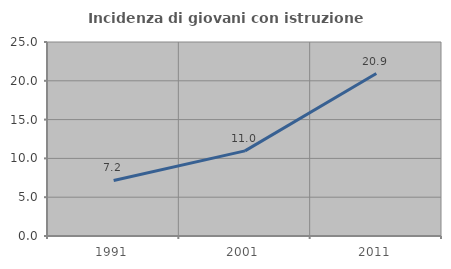
| Category | Incidenza di giovani con istruzione universitaria |
|---|---|
| 1991.0 | 7.16 |
| 2001.0 | 10.966 |
| 2011.0 | 20.94 |